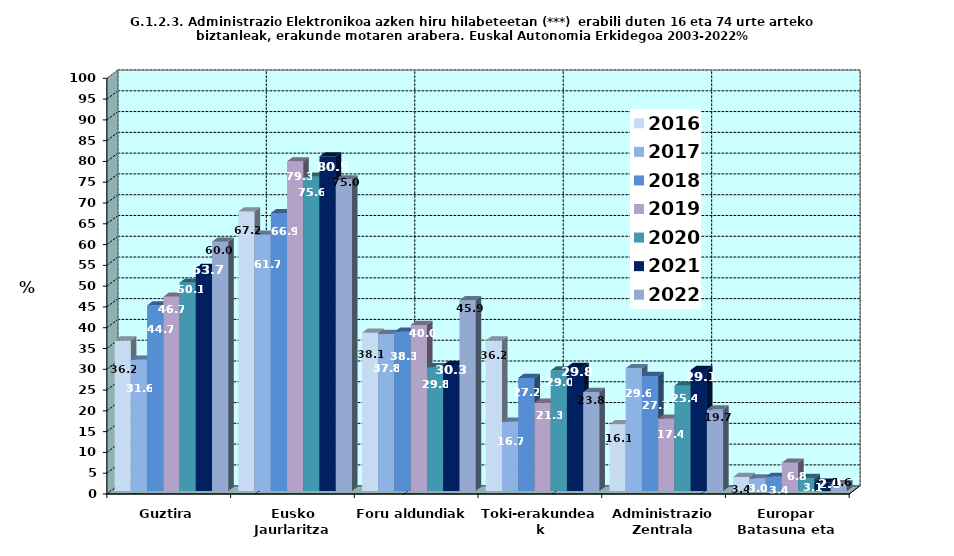
| Category | 2016 | 2017 | 2018 | 2019 | 2020 | 2021 | 2022 |
|---|---|---|---|---|---|---|---|
| Guztira | 36.231 | 31.608 | 44.663 | 46.748 | 50.139 | 53.699 | 59.995 |
| Eusko Jaurlaritza | 67.249 | 61.687 | 66.88 | 79.325 | 75.608 | 80.505 | 74.974 |
| Foru aldundiak | 38.099 | 37.801 | 38.329 | 39.981 | 29.789 | 30.332 | 45.925 |
| Toki-erakundeak | 36.213 | 16.693 | 27.228 | 21.273 | 29.035 | 29.848 | 23.825 |
| Administrazio Zentrala | 16.081 | 29.562 | 27.688 | 17.433 | 25.367 | 29.122 | 19.657 |
| Europar Batasuna eta beste batzuk | 3.41 | 3.015 | 3.426 | 6.83 | 3.137 | 1.994 | 1.642 |